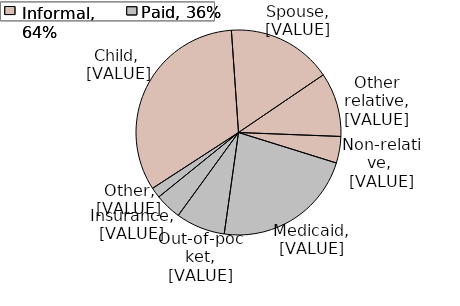
| Category | Series 0 |
|---|---|
| Child | 0.331 |
| Spouse | 0.166 |
| Other relative | 0.101 |
| Non-relative | 0.042 |
| Medicaid | 0.224 |
| Out-of-pocket | 0.078 |
| Insurance | 0.042 |
| Other paid | 0.017 |